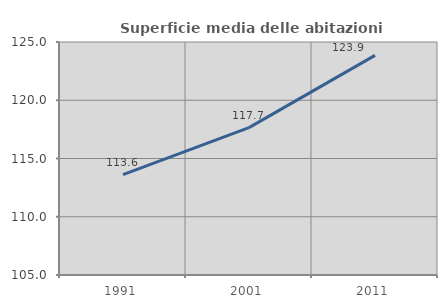
| Category | Superficie media delle abitazioni occupate |
|---|---|
| 1991.0 | 113.617 |
| 2001.0 | 117.653 |
| 2011.0 | 123.851 |